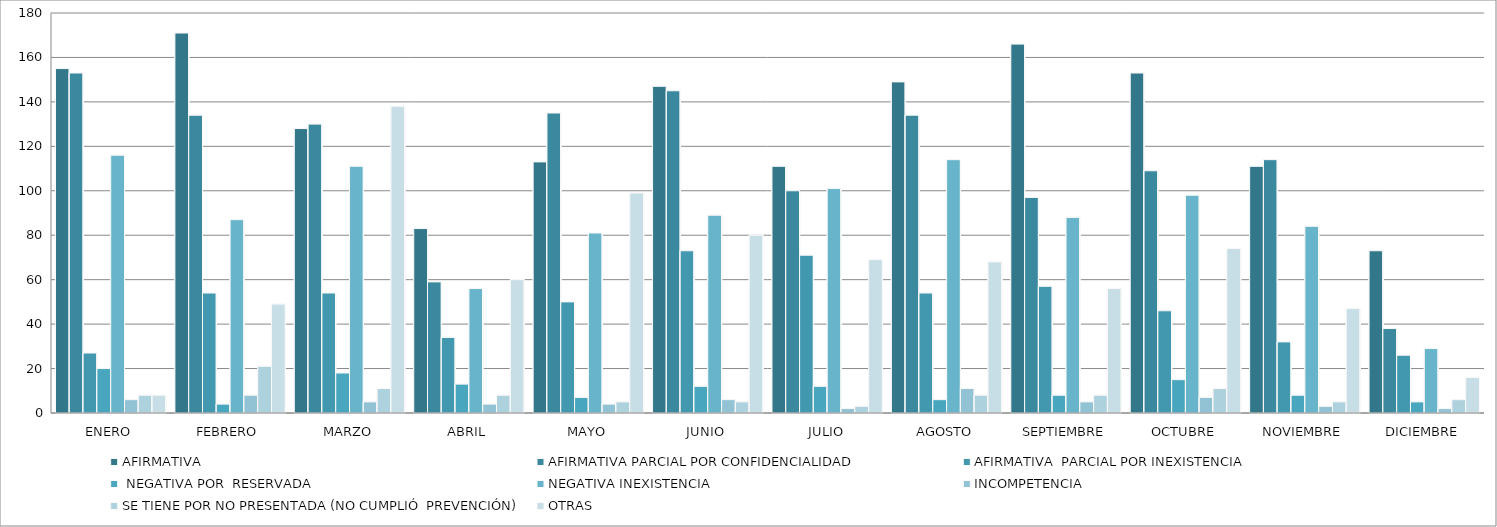
| Category | AFIRMATIVA | AFIRMATIVA PARCIAL POR CONFIDENCIALIDAD  | AFIRMATIVA  PARCIAL POR INEXISTENCIA |  NEGATIVA POR  RESERVADA | NEGATIVA INEXISTENCIA | INCOMPETENCIA | SE TIENE POR NO PRESENTADA (NO CUMPLIÓ  PREVENCIÓN) | OTRAS |
|---|---|---|---|---|---|---|---|---|
| ENERO | 155 | 153 | 27 | 20 | 116 | 6 | 8 | 8 |
| FEBRERO | 171 | 134 | 54 | 4 | 87 | 8 | 21 | 49 |
| MARZO | 128 | 130 | 54 | 18 | 111 | 5 | 11 | 138 |
| ABRIL | 83 | 59 | 34 | 13 | 56 | 4 | 8 | 60 |
| MAYO | 113 | 135 | 50 | 7 | 81 | 4 | 5 | 99 |
| JUNIO | 147 | 145 | 73 | 12 | 89 | 6 | 5 | 80 |
| JULIO | 111 | 100 | 71 | 12 | 101 | 2 | 3 | 69 |
| AGOSTO | 149 | 134 | 54 | 6 | 114 | 11 | 8 | 68 |
| SEPTIEMBRE | 166 | 97 | 57 | 8 | 88 | 5 | 8 | 56 |
| OCTUBRE | 153 | 109 | 46 | 15 | 98 | 7 | 11 | 74 |
| NOVIEMBRE | 111 | 114 | 32 | 8 | 84 | 3 | 5 | 47 |
| DICIEMBRE | 73 | 38 | 26 | 5 | 29 | 2 | 6 | 16 |